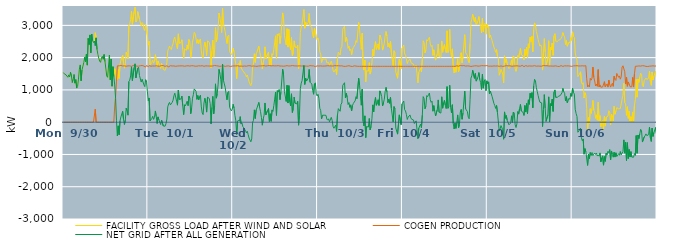
| Category | FACILITY GROSS LOAD AFTER WIND AND SOLAR | COGEN PRODUCTION | NET GRID AFTER ALL GENERATION |
|---|---|---|---|
|  Mon  9/30 | 1537 | 0 | 1537 |
|  Mon  9/30 | 1496 | 0 | 1496 |
|  Mon  9/30 | 1488 | 0 | 1488 |
|  Mon  9/30 | 1464 | 0 | 1464 |
|  Mon  9/30 | 1460 | 0 | 1460 |
|  Mon  9/30 | 1391 | 0 | 1391 |
|  Mon  9/30 | 1466 | 0 | 1466 |
|  Mon  9/30 | 1401 | 0 | 1401 |
|  Mon  9/30 | 1546 | 0 | 1546 |
|  Mon  9/30 | 1435 | 0 | 1435 |
|  Mon  9/30 | 1229 | 0 | 1229 |
|  Mon  9/30 | 1328 | 0 | 1328 |
|  Mon  9/30 | 1478 | 0 | 1478 |
|  Mon  9/30 | 1209 | 0 | 1209 |
|  Mon  9/30 | 1320 | 0 | 1320 |
|  Mon  9/30 | 1057 | 0 | 1057 |
|  Mon  9/30 | 1105 | 0 | 1105 |
|  Mon  9/30 | 1335 | 0 | 1335 |
|  Mon  9/30 | 1644 | 0 | 1644 |
|  Mon  9/30 | 1774 | 0 | 1774 |
|  Mon  9/30 | 1283 | 0 | 1283 |
|  Mon  9/30 | 1619 | 0 | 1619 |
|  Mon  9/30 | 1633 | 0 | 1633 |
|  Mon  9/30 | 1844 | 0 | 1844 |
|  Mon  9/30 | 2014 | 0 | 2014 |
|  Mon  9/30 | 1876 | 0 | 1876 |
|  Mon  9/30 | 2113 | 0 | 2113 |
|  Mon  9/30 | 1767 | 0 | 1767 |
|  Mon  9/30 | 2598 | 0 | 2598 |
|  Mon  9/30 | 2404 | 0 | 2404 |
|  Mon  9/30 | 2704 | 0 | 2704 |
|  Mon  9/30 | 2148 | 0 | 2148 |
|  Mon  9/30 | 2732 | 0 | 2732 |
|  Mon  9/30 | 2526 | 0 | 2526 |
|  Mon  9/30 | 2469 | 0 | 2469 |
|  Mon  9/30 | 2515 | 0 | 2515 |
|  Mon  9/30 | 2774 | 402 | 2372 |
|  Mon  9/30 | 2613 | 0 | 2613 |
|  Mon  9/30 | 2250 | 0 | 2250 |
|  Mon  9/30 | 2100 | 0 | 2100 |
|  Mon  9/30 | 1979 | 0 | 1979 |
|  Mon  9/30 | 1889 | 0 | 1889 |
|  Mon  9/30 | 1854 | 0 | 1854 |
|  Mon  9/30 | 1988 | 0 | 1988 |
|  Mon  9/30 | 2040 | 0 | 2040 |
|  Mon  9/30 | 1949 | 0 | 1949 |
|  Mon  9/30 | 2098 | 0 | 2098 |
|  Mon  9/30 | 1878 | 0 | 1878 |
|  Mon  9/30 | 1901 | 0 | 1901 |
|  Mon  9/30 | 1429 | 0 | 1429 |
|  Mon  9/30 | 1390 | 0 | 1390 |
|  Mon  9/30 | 1385 | 0 | 1385 |
|  Mon  9/30 | 2080 | 0 | 2080 |
|  Mon  9/30 | 1313 | 0 | 1313 |
|  Mon  9/30 | 1958 | 0 | 1958 |
|  Mon  9/30 | 1113 | 0 | 1113 |
|  Mon  9/30 | 1721 | 0 | 1721 |
|  Mon  9/30 | 1407 | 0 | 1407 |
|  Mon  9/30 | 1657 | 503 | 1154 |
|  Mon  9/30 | 1542 | 807 | 735 |
|  Mon  9/30 | 1292 | 1248 | 44 |
|  Mon  9/30 | 1323 | 1747 | -424 |
|  Mon  9/30 | 1630 | 1743 | -113 |
|  Mon  9/30 | 1355 | 1745 | -390 |
|  Mon  9/30 | 1781 | 1746 | 35 |
|  Mon  9/30 | 1922 | 1759 | 163 |
|  Mon  9/30 | 1892 | 1749 | 143 |
|  Mon  9/30 | 2078 | 1741 | 337 |
|  Mon  9/30 | 1828 | 1748 | 80 |
|  Mon  9/30 | 1673 | 1745 | -72 |
|  Mon  9/30 | 1812 | 1747 | 65 |
|  Mon  9/30 | 2166 | 1734 | 432 |
|  Mon  9/30 | 2103 | 1744 | 359 |
|  Mon  9/30 | 1961 | 1744 | 217 |
|  Mon  9/30 | 2990 | 1731 | 1259 |
|  Mon  9/30 | 3046 | 1745 | 1301 |
|  Mon  9/30 | 3176 | 1743 | 1433 |
|  Mon  9/30 | 3445 | 1731 | 1714 |
|  Mon  9/30 | 3027 | 1736 | 1291 |
|  Mon  9/30 | 3045 | 1758 | 1287 |
|  Mon  9/30 | 3434 | 1741 | 1693 |
|  Mon  9/30 | 3561 | 1752 | 1809 |
|  Mon  9/30 | 3103 | 1731 | 1372 |
|  Mon  9/30 | 3136 | 1736 | 1400 |
|  Mon  9/30 | 3430 | 1760 | 1670 |
|  Mon  9/30 | 3438 | 1735 | 1703 |
|  Mon  9/30 | 3188 | 1741 | 1447 |
|  Mon  9/30 | 3182 | 1749 | 1433 |
|  Mon  9/30 | 2986 | 1743 | 1243 |
|  Mon  9/30 | 3088 | 1756 | 1332 |
|  Mon  9/30 | 3048 | 1734 | 1314 |
|  Mon  9/30 | 2897 | 1739 | 1158 |
|  Mon  9/30 | 2840 | 1737 | 1103 |
|  Mon  9/30 | 3025 | 1709 | 1316 |
|  Mon  9/30 | 2995 | 1756 | 1239 |
|  Mon  9/30 | 2684 | 1745 | 939 |
|  Tue  10/1 | 2388 | 1720 | 668 |
|  Tue  10/1 | 2504 | 1754 | 750 |
|  Tue  10/1 | 1772 | 1735 | 37 |
|  Tue  10/1 | 1800 | 1735 | 65 |
|  Tue  10/1 | 1854 | 1738 | 116 |
|  Tue  10/1 | 1924 | 1742 | 182 |
|  Tue  10/1 | 1829 | 1742 | 87 |
|  Tue  10/1 | 1893 | 1740 | 153 |
|  Tue  10/1 | 2093 | 1745 | 348 |
|  Tue  10/1 | 1922 | 1747 | 175 |
|  Tue  10/1 | 1707 | 1748 | -41 |
|  Tue  10/1 | 1900 | 1736 | 164 |
|  Tue  10/1 | 1817 | 1746 | 71 |
|  Tue  10/1 | 1832 | 1735 | 97 |
|  Tue  10/1 | 1666 | 1740 | -74 |
|  Tue  10/1 | 1822 | 1755 | 67 |
|  Tue  10/1 | 1779 | 1728 | 51 |
|  Tue  10/1 | 1634 | 1753 | -119 |
|  Tue  10/1 | 1647 | 1742 | -95 |
|  Tue  10/1 | 1606 | 1730 | -124 |
|  Tue  10/1 | 1691 | 1737 | -46 |
|  Tue  10/1 | 1842 | 1747 | 95 |
|  Tue  10/1 | 2209 | 1734 | 475 |
|  Tue  10/1 | 2282 | 1717 | 565 |
|  Tue  10/1 | 2359 | 1746 | 613 |
|  Tue  10/1 | 2285 | 1750 | 535 |
|  Tue  10/1 | 2253 | 1727 | 526 |
|  Tue  10/1 | 2354 | 1741 | 613 |
|  Tue  10/1 | 2430 | 1750 | 680 |
|  Tue  10/1 | 2563 | 1743 | 820 |
|  Tue  10/1 | 2637 | 1740 | 897 |
|  Tue  10/1 | 2608 | 1732 | 876 |
|  Tue  10/1 | 2375 | 1723 | 652 |
|  Tue  10/1 | 2268 | 1741 | 527 |
|  Tue  10/1 | 2738 | 1742 | 996 |
|  Tue  10/1 | 2444 | 1743 | 701 |
|  Tue  10/1 | 2471 | 1740 | 731 |
|  Tue  10/1 | 2466 | 1745 | 721 |
|  Tue  10/1 | 2555 | 1746 | 809 |
|  Tue  10/1 | 2253 | 1745 | 508 |
|  Tue  10/1 | 1974 | 1740 | 234 |
|  Tue  10/1 | 2273 | 1734 | 539 |
|  Tue  10/1 | 2254 | 1748 | 506 |
|  Tue  10/1 | 2222 | 1744 | 478 |
|  Tue  10/1 | 2396 | 1744 | 652 |
|  Tue  10/1 | 2259 | 1748 | 511 |
|  Tue  10/1 | 2560 | 1754 | 806 |
|  Tue  10/1 | 2482 | 1738 | 744 |
|  Tue  10/1 | 2009 | 1747 | 262 |
|  Tue  10/1 | 2185 | 1750 | 435 |
|  Tue  10/1 | 2481 | 1740 | 741 |
|  Tue  10/1 | 2603 | 1747 | 856 |
|  Tue  10/1 | 2785 | 1754 | 1031 |
|  Tue  10/1 | 2740 | 1735 | 1005 |
|  Tue  10/1 | 2721 | 1763 | 958 |
|  Tue  10/1 | 2443 | 1736 | 707 |
|  Tue  10/1 | 2560 | 1735 | 825 |
|  Tue  10/1 | 2436 | 1747 | 689 |
|  Tue  10/1 | 2546 | 1754 | 792 |
|  Tue  10/1 | 2579 | 1742 | 837 |
|  Tue  10/1 | 2215 | 1741 | 474 |
|  Tue  10/1 | 2033 | 1750 | 283 |
|  Tue  10/1 | 1985 | 1750 | 235 |
|  Tue  10/1 | 2328 | 1732 | 596 |
|  Tue  10/1 | 2483 | 1743 | 740 |
|  Tue  10/1 | 2335 | 1745 | 590 |
|  Tue  10/1 | 2059 | 1747 | 312 |
|  Tue  10/1 | 2517 | 1742 | 775 |
|  Tue  10/1 | 2492 | 1735 | 757 |
|  Tue  10/1 | 2475 | 1740 | 735 |
|  Tue  10/1 | 2324 | 1751 | 573 |
|  Tue  10/1 | 1681 | 1738 | -57 |
|  Tue  10/1 | 2203 | 1744 | 459 |
|  Tue  10/1 | 2541 | 1742 | 799 |
|  Tue  10/1 | 2016 | 1756 | 260 |
|  Tue  10/1 | 2255 | 1756 | 499 |
|  Tue  10/1 | 2930 | 1742 | 1188 |
|  Tue  10/1 | 2493 | 1749 | 744 |
|  Tue  10/1 | 2622 | 1736 | 886 |
|  Tue  10/1 | 2920 | 1740 | 1180 |
|  Tue  10/1 | 3381 | 1746 | 1635 |
|  Tue  10/1 | 3235 | 1730 | 1505 |
|  Tue  10/1 | 3070 | 1740 | 1330 |
|  Tue  10/1 | 2778 | 1739 | 1039 |
|  Tue  10/1 | 3537 | 1739 | 1798 |
|  Tue  10/1 | 3042 | 1743 | 1299 |
|  Tue  10/1 | 2932 | 1745 | 1187 |
|  Tue  10/1 | 2806 | 1729 | 1077 |
|  Tue  10/1 | 2613 | 1738 | 875 |
|  Tue  10/1 | 2436 | 1742 | 694 |
|  Tue  10/1 | 2665 | 1743 | 922 |
|  Tue  10/1 | 2698 | 1743 | 955 |
|  Tue  10/1 | 2185 | 1728 | 457 |
|  Tue  10/1 | 2173 | 1725 | 448 |
|  Tue  10/1 | 2086 | 1736 | 350 |
|  Tue  10/1 | 2146 | 1739 | 407 |
|  Wed  10/2 | 2296 | 1742 | 554 |
|  Wed  10/2 | 2182 | 1743 | 439 |
|  Wed  10/2 | 1956 | 1749 | 207 |
|  Wed  10/2 | 1793 | 1743 | 50 |
|  Wed  10/2 | 1351 | 1734 | -383 |
|  Wed  10/2 | 1776 | 1749 | 27 |
|  Wed  10/2 | 1814 | 1749 | 65 |
|  Wed  10/2 | 1765 | 1734 | 31 |
|  Wed  10/2 | 1911 | 1739 | 172 |
|  Wed  10/2 | 1681 | 1739 | -58 |
|  Wed  10/2 | 1699 | 1726 | -27 |
|  Wed  10/2 | 1591 | 1734 | -143 |
|  Wed  10/2 | 1574 | 1749 | -175 |
|  Wed  10/2 | 1518 | 1741 | -223 |
|  Wed  10/2 | 1482 | 1745 | -263 |
|  Wed  10/2 | 1401 | 1734 | -333 |
|  Wed  10/2 | 1463 | 1744 | -281 |
|  Wed  10/2 | 1363 | 1750 | -387 |
|  Wed  10/2 | 1248 | 1741 | -493 |
|  Wed  10/2 | 1231 | 1750 | -519 |
|  Wed  10/2 | 1131 | 1738 | -607 |
|  Wed  10/2 | 1216 | 1735 | -519 |
|  Wed  10/2 | 1737 | 1743 | -6 |
|  Wed  10/2 | 1800 | 1742 | 58 |
|  Wed  10/2 | 2122 | 1740 | 382 |
|  Wed  10/2 | 1848 | 1735 | 113 |
|  Wed  10/2 | 2117 | 1740 | 377 |
|  Wed  10/2 | 2174 | 1731 | 443 |
|  Wed  10/2 | 2278 | 1747 | 531 |
|  Wed  10/2 | 2354 | 1742 | 612 |
|  Wed  10/2 | 2184 | 1734 | 450 |
|  Wed  10/2 | 2068 | 1743 | 325 |
|  Wed  10/2 | 1893 | 1753 | 140 |
|  Wed  10/2 | 1653 | 1746 | -93 |
|  Wed  10/2 | 1835 | 1738 | 97 |
|  Wed  10/2 | 1969 | 1751 | 218 |
|  Wed  10/2 | 2335 | 1740 | 595 |
|  Wed  10/2 | 1965 | 1738 | 227 |
|  Wed  10/2 | 1966 | 1742 | 224 |
|  Wed  10/2 | 2117 | 1749 | 368 |
|  Wed  10/2 | 2168 | 1741 | 427 |
|  Wed  10/2 | 1777 | 1755 | 22 |
|  Wed  10/2 | 2004 | 1743 | 261 |
|  Wed  10/2 | 1770 | 1743 | 27 |
|  Wed  10/2 | 2122 | 1742 | 380 |
|  Wed  10/2 | 2084 | 1750 | 334 |
|  Wed  10/2 | 2258 | 1744 | 514 |
|  Wed  10/2 | 2458 | 1744 | 714 |
|  Wed  10/2 | 2676 | 1743 | 933 |
|  Wed  10/2 | 1956 | 1746 | 210 |
|  Wed  10/2 | 2734 | 1755 | 979 |
|  Wed  10/2 | 2688 | 1752 | 936 |
|  Wed  10/2 | 2750 | 1740 | 1010 |
|  Wed  10/2 | 2438 | 1739 | 699 |
|  Wed  10/2 | 2677 | 1747 | 930 |
|  Wed  10/2 | 2666 | 1740 | 926 |
|  Wed  10/2 | 3387 | 1746 | 1641 |
|  Wed  10/2 | 3205 | 1734 | 1471 |
|  Wed  10/2 | 2691 | 1743 | 948 |
|  Wed  10/2 | 2661 | 1741 | 920 |
|  Wed  10/2 | 2395 | 1752 | 643 |
|  Wed  10/2 | 2896 | 1752 | 1144 |
|  Wed  10/2 | 2326 | 1733 | 593 |
|  Wed  10/2 | 2874 | 1740 | 1134 |
|  Wed  10/2 | 2375 | 1744 | 631 |
|  Wed  10/2 | 2251 | 1745 | 506 |
|  Wed  10/2 | 2629 | 1750 | 879 |
|  Wed  10/2 | 2055 | 1754 | 301 |
|  Wed  10/2 | 2169 | 1741 | 428 |
|  Wed  10/2 | 2521 | 1745 | 776 |
|  Wed  10/2 | 2326 | 1738 | 588 |
|  Wed  10/2 | 2326 | 1743 | 583 |
|  Wed  10/2 | 2309 | 1742 | 567 |
|  Wed  10/2 | 2392 | 1741 | 651 |
|  Wed  10/2 | 1649 | 1742 | -93 |
|  Wed  10/2 | 1959 | 1746 | 213 |
|  Wed  10/2 | 2776 | 1738 | 1038 |
|  Wed  10/2 | 2950 | 1741 | 1209 |
|  Wed  10/2 | 3031 | 1741 | 1290 |
|  Wed  10/2 | 3026 | 1741 | 1285 |
|  Wed  10/2 | 3490 | 1734 | 1756 |
|  Wed  10/2 | 2910 | 1740 | 1170 |
|  Wed  10/2 | 3106 | 1741 | 1365 |
|  Wed  10/2 | 3012 | 1737 | 1275 |
|  Wed  10/2 | 3001 | 1751 | 1250 |
|  Wed  10/2 | 3099 | 1735 | 1364 |
|  Wed  10/2 | 3368 | 1734 | 1634 |
|  Wed  10/2 | 2991 | 1753 | 1238 |
|  Wed  10/2 | 2970 | 1755 | 1215 |
|  Wed  10/2 | 2929 | 1746 | 1183 |
|  Wed  10/2 | 2710 | 1728 | 982 |
|  Wed  10/2 | 2609 | 1744 | 865 |
|  Wed  10/2 | 2920 | 1734 | 1186 |
|  Wed  10/2 | 2941 | 1721 | 1220 |
|  Wed  10/2 | 2641 | 1743 | 898 |
|  Wed  10/2 | 2557 | 1745 | 812 |
|  Thu  10/3 | 2612 | 1748 | 864 |
|  Thu  10/3 | 2483 | 1740 | 743 |
|  Thu  10/3 | 2172 | 1742 | 430 |
|  Thu  10/3 | 2110 | 1744 | 366 |
|  Thu  10/3 | 1849 | 1745 | 104 |
|  Thu  10/3 | 1952 | 1738 | 214 |
|  Thu  10/3 | 1924 | 1732 | 192 |
|  Thu  10/3 | 1955 | 1739 | 216 |
|  Thu  10/3 | 1947 | 1747 | 200 |
|  Thu  10/3 | 1954 | 1742 | 212 |
|  Thu  10/3 | 1840 | 1745 | 95 |
|  Thu  10/3 | 1814 | 1750 | 64 |
|  Thu  10/3 | 1847 | 1743 | 104 |
|  Thu  10/3 | 1756 | 1744 | 12 |
|  Thu  10/3 | 1739 | 1750 | -11 |
|  Thu  10/3 | 1892 | 1742 | 150 |
|  Thu  10/3 | 1787 | 1732 | 55 |
|  Thu  10/3 | 1611 | 1739 | -128 |
|  Thu  10/3 | 1553 | 1741 | -188 |
|  Thu  10/3 | 1581 | 1753 | -172 |
|  Thu  10/3 | 1649 | 1741 | -92 |
|  Thu  10/3 | 1463 | 1748 | -285 |
|  Thu  10/3 | 1960 | 1741 | 219 |
|  Thu  10/3 | 2169 | 1749 | 420 |
|  Thu  10/3 | 2168 | 1743 | 425 |
|  Thu  10/3 | 2081 | 1743 | 338 |
|  Thu  10/3 | 2298 | 1740 | 558 |
|  Thu  10/3 | 2341 | 1747 | 594 |
|  Thu  10/3 | 2883 | 1740 | 1143 |
|  Thu  10/3 | 2857 | 1731 | 1126 |
|  Thu  10/3 | 2975 | 1752 | 1223 |
|  Thu  10/3 | 2483 | 1729 | 754 |
|  Thu  10/3 | 2639 | 1741 | 898 |
|  Thu  10/3 | 2504 | 1740 | 764 |
|  Thu  10/3 | 2291 | 1745 | 546 |
|  Thu  10/3 | 2358 | 1749 | 609 |
|  Thu  10/3 | 2213 | 1753 | 460 |
|  Thu  10/3 | 2270 | 1733 | 537 |
|  Thu  10/3 | 2089 | 1741 | 348 |
|  Thu  10/3 | 2243 | 1726 | 517 |
|  Thu  10/3 | 2317 | 1735 | 582 |
|  Thu  10/3 | 2323 | 1746 | 577 |
|  Thu  10/3 | 2399 | 1736 | 663 |
|  Thu  10/3 | 2528 | 1738 | 790 |
|  Thu  10/3 | 2470 | 1743 | 727 |
|  Thu  10/3 | 2482 | 1731 | 751 |
|  Thu  10/3 | 3089 | 1731 | 1358 |
|  Thu  10/3 | 2876 | 1731 | 1145 |
|  Thu  10/3 | 2555 | 1731 | 824 |
|  Thu  10/3 | 2257 | 1731 | 526 |
|  Thu  10/3 | 2754 | 1731 | 1023 |
|  Thu  10/3 | 1762 | 1731 | 31 |
|  Thu  10/3 | 1614 | 1731 | -117 |
|  Thu  10/3 | 1927 | 1731 | 196 |
|  Thu  10/3 | 1254 | 1731 | -477 |
|  Thu  10/3 | 1597 | 1731 | -134 |
|  Thu  10/3 | 1591 | 1731 | -140 |
|  Thu  10/3 | 1580 | 1731 | -151 |
|  Thu  10/3 | 1845 | 1731 | 114 |
|  Thu  10/3 | 1491 | 1731 | -240 |
|  Thu  10/3 | 1596 | 1731 | -135 |
|  Thu  10/3 | 1839 | 1731 | 108 |
|  Thu  10/3 | 2267 | 1731 | 536 |
|  Thu  10/3 | 2051 | 1731 | 320 |
|  Thu  10/3 | 2356 | 1731 | 625 |
|  Thu  10/3 | 2497 | 1731 | 766 |
|  Thu  10/3 | 2255 | 1731 | 524 |
|  Thu  10/3 | 2326 | 1731 | 595 |
|  Thu  10/3 | 2426 | 1731 | 695 |
|  Thu  10/3 | 2251 | 1731 | 520 |
|  Thu  10/3 | 2700 | 1731 | 969 |
|  Thu  10/3 | 2632 | 1731 | 901 |
|  Thu  10/3 | 2530 | 1731 | 799 |
|  Thu  10/3 | 2233 | 1731 | 502 |
|  Thu  10/3 | 2326 | 1731 | 595 |
|  Thu  10/3 | 2444 | 1731 | 713 |
|  Thu  10/3 | 2689 | 1731 | 958 |
|  Thu  10/3 | 2809 | 1731 | 1078 |
|  Thu  10/3 | 2667 | 1731 | 936 |
|  Thu  10/3 | 2336 | 1731 | 605 |
|  Thu  10/3 | 2441 | 1731 | 710 |
|  Thu  10/3 | 2315 | 1731 | 584 |
|  Thu  10/3 | 2505 | 1731 | 774 |
|  Thu  10/3 | 2154 | 1731 | 423 |
|  Thu  10/3 | 2132 | 1731 | 401 |
|  Thu  10/3 | 1743 | 1731 | 12 |
|  Thu  10/3 | 2213 | 1731 | 482 |
|  Thu  10/3 | 2150 | 1731 | 419 |
|  Thu  10/3 | 1549 | 1731 | -182 |
|  Thu  10/3 | 1537 | 1731 | -194 |
|  Thu  10/3 | 1360 | 1731 | -371 |
|  Thu  10/3 | 1336 | 1731 | -395 |
|  Thu  10/3 | 1957 | 1731 | 226 |
|  Thu  10/3 | 1974 | 1731 | 243 |
|  Thu  10/3 | 1655 | 1731 | -76 |
|  Thu  10/3 | 2294 | 1731 | 563 |
|  Fri  10/4 | 2292 | 1731 | 561 |
|  Fri  10/4 | 2387 | 1731 | 656 |
|  Fri  10/4 | 2118 | 1731 | 387 |
|  Fri  10/4 | 2077 | 1731 | 346 |
|  Fri  10/4 | 1969 | 1731 | 238 |
|  Fri  10/4 | 1815 | 1731 | 84 |
|  Fri  10/4 | 1888 | 1731 | 157 |
|  Fri  10/4 | 1869 | 1731 | 138 |
|  Fri  10/4 | 1955 | 1731 | 224 |
|  Fri  10/4 | 1865 | 1731 | 134 |
|  Fri  10/4 | 1819 | 1731 | 88 |
|  Fri  10/4 | 1817 | 1731 | 86 |
|  Fri  10/4 | 1800 | 1731 | 69 |
|  Fri  10/4 | 1689 | 1731 | -42 |
|  Fri  10/4 | 1686 | 1731 | -45 |
|  Fri  10/4 | 1772 | 1731 | 41 |
|  Fri  10/4 | 1775 | 1731 | 44 |
|  Fri  10/4 | 1221 | 1731 | -510 |
|  Fri  10/4 | 1545 | 1731 | -186 |
|  Fri  10/4 | 1572 | 1731 | -159 |
|  Fri  10/4 | 1670 | 1731 | -61 |
|  Fri  10/4 | 1556 | 1731 | -175 |
|  Fri  10/4 | 1949 | 1731 | 218 |
|  Fri  10/4 | 2523 | 1731 | 792 |
|  Fri  10/4 | 2470 | 1731 | 739 |
|  Fri  10/4 | 2147 | 1731 | 416 |
|  Fri  10/4 | 2228 | 1731 | 497 |
|  Fri  10/4 | 2554 | 1731 | 823 |
|  Fri  10/4 | 2521 | 1731 | 790 |
|  Fri  10/4 | 2582 | 1731 | 851 |
|  Fri  10/4 | 2633 | 1731 | 902 |
|  Fri  10/4 | 2431 | 1731 | 700 |
|  Fri  10/4 | 2346 | 1731 | 615 |
|  Fri  10/4 | 2381 | 1731 | 650 |
|  Fri  10/4 | 2071 | 1731 | 340 |
|  Fri  10/4 | 2244 | 1731 | 513 |
|  Fri  10/4 | 2075 | 1731 | 344 |
|  Fri  10/4 | 1923 | 1731 | 192 |
|  Fri  10/4 | 1925 | 1731 | 194 |
|  Fri  10/4 | 2127 | 1731 | 396 |
|  Fri  10/4 | 2421 | 1731 | 690 |
|  Fri  10/4 | 2039 | 1731 | 308 |
|  Fri  10/4 | 2062 | 1731 | 331 |
|  Fri  10/4 | 2013 | 1731 | 282 |
|  Fri  10/4 | 2518 | 1731 | 787 |
|  Fri  10/4 | 2164 | 1731 | 433 |
|  Fri  10/4 | 2327 | 1731 | 596 |
|  Fri  10/4 | 2407 | 1731 | 676 |
|  Fri  10/4 | 2257 | 1731 | 526 |
|  Fri  10/4 | 2154 | 1731 | 423 |
|  Fri  10/4 | 2832 | 1731 | 1101 |
|  Fri  10/4 | 2159 | 1731 | 428 |
|  Fri  10/4 | 2201 | 1731 | 470 |
|  Fri  10/4 | 2874 | 1731 | 1143 |
|  Fri  10/4 | 2191 | 1731 | 460 |
|  Fri  10/4 | 2017 | 1731 | 286 |
|  Fri  10/4 | 2272 | 1731 | 541 |
|  Fri  10/4 | 1690 | 1731 | -41 |
|  Fri  10/4 | 1525 | 1735 | -210 |
|  Fri  10/4 | 1707 | 1730 | -23 |
|  Fri  10/4 | 1546 | 1738 | -192 |
|  Fri  10/4 | 1731 | 1747 | -16 |
|  Fri  10/4 | 1969 | 1744 | 225 |
|  Fri  10/4 | 1558 | 1735 | -177 |
|  Fri  10/4 | 1667 | 1737 | -70 |
|  Fri  10/4 | 2072 | 1757 | 315 |
|  Fri  10/4 | 2154 | 1760 | 394 |
|  Fri  10/4 | 1838 | 1747 | 91 |
|  Fri  10/4 | 2039 | 1753 | 286 |
|  Fri  10/4 | 2041 | 1754 | 287 |
|  Fri  10/4 | 2711 | 1749 | 962 |
|  Fri  10/4 | 2150 | 1737 | 413 |
|  Fri  10/4 | 2158 | 1731 | 427 |
|  Fri  10/4 | 2072 | 1744 | 328 |
|  Fri  10/4 | 1899 | 1745 | 154 |
|  Fri  10/4 | 1846 | 1740 | 106 |
|  Fri  10/4 | 2437 | 1737 | 700 |
|  Fri  10/4 | 3090 | 1727 | 1363 |
|  Fri  10/4 | 3188 | 1751 | 1437 |
|  Fri  10/4 | 3342 | 1735 | 1607 |
|  Fri  10/4 | 3345 | 1738 | 1607 |
|  Fri  10/4 | 3103 | 1744 | 1359 |
|  Fri  10/4 | 3249 | 1740 | 1509 |
|  Fri  10/4 | 3019 | 1748 | 1271 |
|  Fri  10/4 | 3058 | 1735 | 1323 |
|  Fri  10/4 | 3145 | 1736 | 1409 |
|  Fri  10/4 | 3274 | 1737 | 1537 |
|  Fri  10/4 | 3056 | 1740 | 1316 |
|  Fri  10/4 | 2968 | 1740 | 1228 |
|  Fri  10/4 | 2768 | 1752 | 1016 |
|  Fri  10/4 | 3223 | 1738 | 1485 |
|  Fri  10/4 | 2804 | 1750 | 1054 |
|  Fri  10/4 | 3017 | 1743 | 1274 |
|  Fri  10/4 | 3068 | 1746 | 1322 |
|  Fri  10/4 | 2727 | 1753 | 974 |
|  Fri  10/4 | 3035 | 1754 | 1281 |
|  Sat  10/5 | 2937 | 1751 | 1186 |
|  Sat  10/5 | 2985 | 1735 | 1250 |
|  Sat  10/5 | 2616 | 1742 | 874 |
|  Sat  10/5 | 2703 | 1737 | 966 |
|  Sat  10/5 | 2717 | 1752 | 965 |
|  Sat  10/5 | 2525 | 1735 | 790 |
|  Sat  10/5 | 2520 | 1738 | 782 |
|  Sat  10/5 | 2323 | 1743 | 580 |
|  Sat  10/5 | 2255 | 1741 | 514 |
|  Sat  10/5 | 2164 | 1739 | 425 |
|  Sat  10/5 | 2250 | 1732 | 518 |
|  Sat  10/5 | 2043 | 1743 | 300 |
|  Sat  10/5 | 2005 | 1733 | 272 |
|  Sat  10/5 | 1456 | 1730 | -274 |
|  Sat  10/5 | 1535 | 1744 | -209 |
|  Sat  10/5 | 1638 | 1743 | -105 |
|  Sat  10/5 | 1614 | 1743 | -129 |
|  Sat  10/5 | 1491 | 1728 | -237 |
|  Sat  10/5 | 1218 | 1746 | -528 |
|  Sat  10/5 | 2056 | 1738 | 318 |
|  Sat  10/5 | 1854 | 1734 | 120 |
|  Sat  10/5 | 1957 | 1750 | 207 |
|  Sat  10/5 | 1814 | 1756 | 58 |
|  Sat  10/5 | 1829 | 1744 | 85 |
|  Sat  10/5 | 1658 | 1739 | -81 |
|  Sat  10/5 | 1690 | 1747 | -57 |
|  Sat  10/5 | 1711 | 1737 | -26 |
|  Sat  10/5 | 1931 | 1734 | 197 |
|  Sat  10/5 | 1738 | 1743 | -5 |
|  Sat  10/5 | 2053 | 1738 | 315 |
|  Sat  10/5 | 2022 | 1739 | 283 |
|  Sat  10/5 | 1668 | 1743 | -75 |
|  Sat  10/5 | 1575 | 1741 | -166 |
|  Sat  10/5 | 1696 | 1747 | -51 |
|  Sat  10/5 | 2065 | 1737 | 328 |
|  Sat  10/5 | 1989 | 1739 | 250 |
|  Sat  10/5 | 2156 | 1738 | 418 |
|  Sat  10/5 | 2284 | 1734 | 550 |
|  Sat  10/5 | 2089 | 1746 | 343 |
|  Sat  10/5 | 2085 | 1761 | 324 |
|  Sat  10/5 | 2052 | 1749 | 303 |
|  Sat  10/5 | 1931 | 1721 | 210 |
|  Sat  10/5 | 2258 | 1742 | 516 |
|  Sat  10/5 | 2066 | 1752 | 314 |
|  Sat  10/5 | 2325 | 1747 | 578 |
|  Sat  10/5 | 1999 | 1734 | 265 |
|  Sat  10/5 | 2428 | 1735 | 693 |
|  Sat  10/5 | 2296 | 1743 | 553 |
|  Sat  10/5 | 2634 | 1740 | 894 |
|  Sat  10/5 | 2496 | 1739 | 757 |
|  Sat  10/5 | 2660 | 1745 | 915 |
|  Sat  10/5 | 2185 | 1739 | 446 |
|  Sat  10/5 | 2863 | 1736 | 1127 |
|  Sat  10/5 | 3079 | 1751 | 1328 |
|  Sat  10/5 | 3020 | 1736 | 1284 |
|  Sat  10/5 | 2805 | 1735 | 1070 |
|  Sat  10/5 | 2702 | 1748 | 954 |
|  Sat  10/5 | 2568 | 1740 | 828 |
|  Sat  10/5 | 2455 | 1742 | 713 |
|  Sat  10/5 | 2356 | 1736 | 620 |
|  Sat  10/5 | 2395 | 1747 | 648 |
|  Sat  10/5 | 2332 | 1734 | 598 |
|  Sat  10/5 | 1614 | 1750 | -136 |
|  Sat  10/5 | 2139 | 1756 | 383 |
|  Sat  10/5 | 2590 | 1737 | 853 |
|  Sat  10/5 | 2180 | 1749 | 431 |
|  Sat  10/5 | 1772 | 1748 | 24 |
|  Sat  10/5 | 1783 | 1750 | 33 |
|  Sat  10/5 | 1969 | 1750 | 219 |
|  Sat  10/5 | 2525 | 1740 | 785 |
|  Sat  10/5 | 1757 | 1750 | 7 |
|  Sat  10/5 | 2315 | 1741 | 574 |
|  Sat  10/5 | 2241 | 1740 | 501 |
|  Sat  10/5 | 2454 | 1737 | 717 |
|  Sat  10/5 | 2074 | 1741 | 333 |
|  Sat  10/5 | 2671 | 1738 | 933 |
|  Sat  10/5 | 2742 | 1742 | 1000 |
|  Sat  10/5 | 2512 | 1745 | 767 |
|  Sat  10/5 | 2480 | 1729 | 751 |
|  Sat  10/5 | 2502 | 1730 | 772 |
|  Sat  10/5 | 2540 | 1736 | 804 |
|  Sat  10/5 | 2535 | 1727 | 808 |
|  Sat  10/5 | 2561 | 1738 | 823 |
|  Sat  10/5 | 2599 | 1753 | 846 |
|  Sat  10/5 | 2658 | 1748 | 910 |
|  Sat  10/5 | 2776 | 1728 | 1048 |
|  Sat  10/5 | 2685 | 1743 | 942 |
|  Sat  10/5 | 2643 | 1747 | 896 |
|  Sat  10/5 | 2409 | 1749 | 660 |
|  Sat  10/5 | 2534 | 1743 | 791 |
|  Sat  10/5 | 2352 | 1750 | 602 |
|  Sat  10/5 | 2409 | 1744 | 665 |
|  Sat  10/5 | 2485 | 1744 | 741 |
|  Sat  10/5 | 2447 | 1739 | 708 |
|  Sat  10/5 | 2623 | 1731 | 892 |
|  Sat  10/5 | 2532 | 1729 | 803 |
|  Sun  10/6 | 2801 | 1750 | 1051 |
|  Sun  10/6 | 2663 | 1745 | 918 |
|  Sun  10/6 | 2626 | 1754 | 872 |
|  Sun  10/6 | 2144 | 1746 | 398 |
|  Sun  10/6 | 2014 | 1746 | 268 |
|  Sun  10/6 | 1923 | 1750 | 173 |
|  Sun  10/6 | 1412 | 1724 | -312 |
|  Sun  10/6 | 1459 | 1741 | -282 |
|  Sun  10/6 | 1497 | 1732 | -235 |
|  Sun  10/6 | 1561 | 1742 | -181 |
|  Sun  10/6 | 1251 | 1734 | -483 |
|  Sun  10/6 | 1173 | 1748 | -575 |
|  Sun  10/6 | 1225 | 1744 | -519 |
|  Sun  10/6 | 748 | 1740 | -992 |
|  Sun  10/6 | 913 | 1732 | -819 |
|  Sun  10/6 | 833 | 1751 | -918 |
|  Sun  10/6 | 428 | 1344 | -916 |
|  Sun  10/6 | -245 | 1094 | -1339 |
|  Sun  10/6 | 143 | 1136 | -993 |
|  Sun  10/6 | -37 | 1092 | -1129 |
|  Sun  10/6 | 418 | 1359 | -941 |
|  Sun  10/6 | 272 | 1301 | -1029 |
|  Sun  10/6 | 425 | 1365 | -940 |
|  Sun  10/6 | 673 | 1708 | -1035 |
|  Sun  10/6 | 372 | 1388 | -1016 |
|  Sun  10/6 | 322 | 1277 | -955 |
|  Sun  10/6 | 120 | 1121 | -1001 |
|  Sun  10/6 | 227 | 1181 | -954 |
|  Sun  10/6 | 62 | 1112 | -1050 |
|  Sun  10/6 | 618 | 1629 | -1011 |
|  Sun  10/6 | 39 | 1091 | -1052 |
|  Sun  10/6 | 203 | 1155 | -952 |
|  Sun  10/6 | -142 | 1084 | -1226 |
|  Sun  10/6 | -19 | 1085 | -1104 |
|  Sun  10/6 | 48 | 1091 | -1043 |
|  Sun  10/6 | -239 | 1093 | -1332 |
|  Sun  10/6 | 189 | 1255 | -1066 |
|  Sun  10/6 | -121 | 1093 | -1214 |
|  Sun  10/6 | 156 | 1113 | -957 |
|  Sun  10/6 | 169 | 1185 | -1016 |
|  Sun  10/6 | 184 | 1087 | -903 |
|  Sun  10/6 | 356 | 1303 | -947 |
|  Sun  10/6 | 316 | 1166 | -850 |
|  Sun  10/6 | -79 | 1087 | -1166 |
|  Sun  10/6 | 253 | 1145 | -892 |
|  Sun  10/6 | 208 | 1207 | -999 |
|  Sun  10/6 | 26 | 1110 | -1084 |
|  Sun  10/6 | 492 | 1424 | -932 |
|  Sun  10/6 | 246 | 1327 | -1081 |
|  Sun  10/6 | 345 | 1294 | -949 |
|  Sun  10/6 | 451 | 1511 | -1060 |
|  Sun  10/6 | 451 | 1494 | -1043 |
|  Sun  10/6 | 414 | 1391 | -977 |
|  Sun  10/6 | 409 | 1434 | -1025 |
|  Sun  10/6 | 421 | 1332 | -911 |
|  Sun  10/6 | 396 | 1406 | -1010 |
|  Sun  10/6 | 712 | 1710 | -998 |
|  Sun  10/6 | 838 | 1748 | -910 |
|  Sun  10/6 | 1204 | 1752 | -548 |
|  Sun  10/6 | 604 | 1564 | -960 |
|  Sun  10/6 | 565 | 1182 | -617 |
|  Sun  10/6 | 213 | 1400 | -1187 |
|  Sun  10/6 | 479 | 1112 | -633 |
|  Sun  10/6 | 119 | 1247 | -1128 |
|  Sun  10/6 | 342 | 1188 | -846 |
|  Sun  10/6 | 20 | 1100 | -1080 |
|  Sun  10/6 | 170 | 1082 | -912 |
|  Sun  10/6 | 15 | 1096 | -1081 |
|  Sun  10/6 | 317 | 1386 | -1069 |
|  Sun  10/6 | 3 | 1089 | -1086 |
|  Sun  10/6 | 529 | 1501 | -972 |
|  Sun  10/6 | 705 | 1733 | -1028 |
|  Sun  10/6 | 1327 | 1742 | -415 |
|  Sun  10/6 | 774 | 1736 | -962 |
|  Sun  10/6 | 1338 | 1735 | -397 |
|  Sun  10/6 | 1235 | 1743 | -508 |
|  Sun  10/6 | 1391 | 1753 | -362 |
|  Sun  10/6 | 1515 | 1737 | -222 |
|  Sun  10/6 | 1481 | 1751 | -270 |
|  Sun  10/6 | 1135 | 1751 | -616 |
|  Sun  10/6 | 1098 | 1744 | -646 |
|  Sun  10/6 | 1286 | 1745 | -459 |
|  Sun  10/6 | 1312 | 1734 | -422 |
|  Sun  10/6 | 1367 | 1730 | -363 |
|  Sun  10/6 | 1324 | 1740 | -416 |
|  Sun  10/6 | 1308 | 1725 | -417 |
|  Sun  10/6 | 1362 | 1749 | -387 |
|  Sun  10/6 | 1585 | 1736 | -151 |
|  Sun  10/6 | 1264 | 1748 | -484 |
|  Sun  10/6 | 1142 | 1739 | -597 |
|  Sun  10/6 | 1557 | 1739 | -182 |
|  Sun  10/6 | 1305 | 1746 | -441 |
|  Sun  10/6 | 1426 | 1748 | -322 |
|  Sun  10/6 | 1428 | 1738 | -310 |
|  Sun  10/6 | 1585 | 1750 | -165 |
|  Sun  10/6 | 1362 | 1742 | -380 |